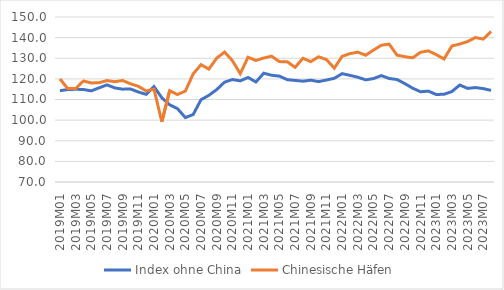
| Category | Index ohne China | Chinesische Häfen |
|---|---|---|
| 2019M01 | 114.266 | 119.983 |
| 2019M02 | 114.804 | 115.272 |
| 2019M03 | 114.958 | 115.292 |
| 2019M04 | 114.842 | 118.988 |
| 2019M05 | 114.189 | 118.026 |
| 2019M06 | 115.668 | 118.141 |
| 2019M07 | 117.089 | 119.178 |
| 2019M08 | 115.617 | 118.641 |
| 2019M09 | 115.015 | 119.197 |
| 2019M10 | 115.11 | 117.626 |
| 2019M11 | 113.644 | 116.395 |
| 2019M12 | 112.501 | 114.155 |
| 2020M01 | 116.297 | 114.994 |
| 2020M02 | 110.838 | 99.182 |
| 2020M03 | 107.44 | 114.29 |
| 2020M04 | 105.548 | 112.409 |
| 2020M05 | 101.234 | 114.081 |
| 2020M06 | 102.72 | 122.403 |
| 2020M07 | 109.898 | 126.892 |
| 2020M08 | 112.027 | 124.734 |
| 2020M09 | 114.808 | 130.067 |
| 2020M10 | 118.409 | 132.999 |
| 2020M11 | 119.678 | 128.856 |
| 2020M12 | 119.04 | 122.523 |
| 2021M01 | 120.672 | 130.507 |
| 2021M02 | 118.5 | 128.916 |
| 2021M03 | 122.762 | 130.107 |
| 2021M04 | 121.748 | 131.004 |
| 2021M05 | 121.331 | 128.37 |
| 2021M06 | 119.613 | 128.311 |
| 2021M07 | 119.255 | 125.58 |
| 2021M08 | 118.883 | 130 |
| 2021M09 | 119.357 | 128.372 |
| 2021M10 | 118.68 | 130.711 |
| 2021M11 | 119.455 | 129.361 |
| 2021M12 | 120.279 | 125.211 |
| 2022M01 | 122.537 | 130.911 |
| 2022M02 | 121.697 | 132.238 |
| 2022M03 | 120.795 | 132.984 |
| 2022M04 | 119.522 | 131.452 |
| 2022M05 | 120.14 | 133.96 |
| 2022M06 | 121.58 | 136.301 |
| 2022M07 | 120.185 | 136.843 |
| 2022M08 | 119.695 | 131.507 |
| 2022M09 | 117.699 | 130.765 |
| 2022M10 | 115.47 | 130.206 |
| 2022M11 | 113.763 | 132.905 |
| 2022M12 | 114.061 | 133.582 |
| 2023M01 | 112.422 | 131.773 |
| 2023M02 | 112.553 | 129.661 |
| 2023M03 | 113.852 | 135.95 |
| 2023M04 | 117.014 | 136.889 |
| 2023M05 | 115.393 | 138.084 |
| 2023M06 | 115.787 | 140.046 |
| 2023M07 | 115.292 | 139.287 |
| 2023M08 | 114.402 | 142.978 |